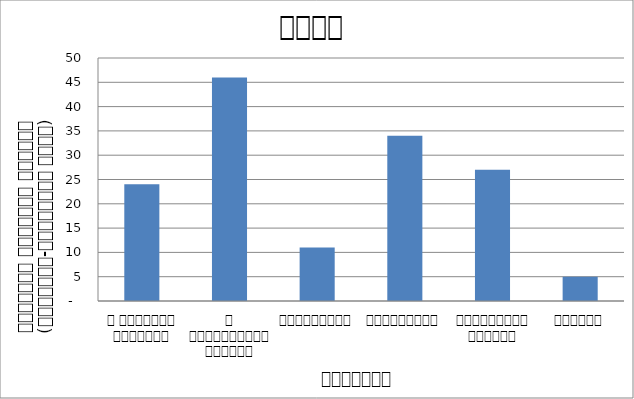
| Category | शासन |
|---|---|
| द हिमालयन टाइम्स् | 24 |
| द काठमाण्डौं पोस्ट् | 46 |
| रिपब्लिका | 11 |
| कान्तिपुर | 34 |
| अन्नपूर्ण पोस्ट् | 27 |
| नागरिक | 5 |